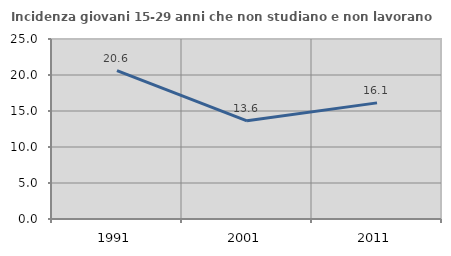
| Category | Incidenza giovani 15-29 anni che non studiano e non lavorano  |
|---|---|
| 1991.0 | 20.599 |
| 2001.0 | 13.636 |
| 2011.0 | 16.129 |